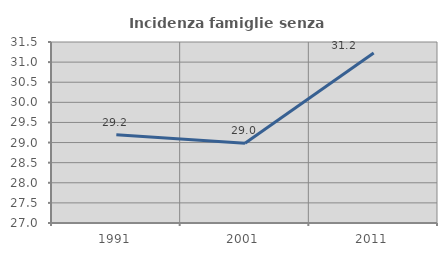
| Category | Incidenza famiglie senza nuclei |
|---|---|
| 1991.0 | 29.195 |
| 2001.0 | 28.982 |
| 2011.0 | 31.227 |